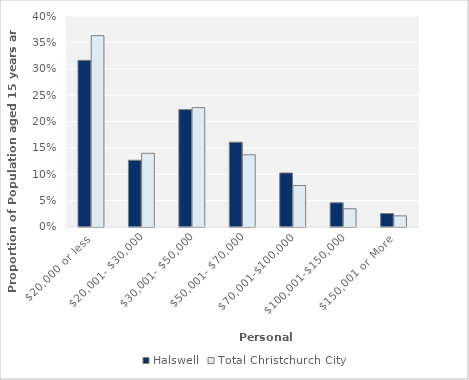
| Category | Halswell | Total Christchurch City |
|---|---|---|
| $20,000 or less | 0.316 | 0.363 |
| $20,001- $30,000 | 0.127 | 0.14 |
| $30,001- $50,000 | 0.223 | 0.226 |
| $50,001- $70,000 | 0.161 | 0.137 |
| $70,001-$100,000 | 0.102 | 0.079 |
| $100,001-$150,000 | 0.046 | 0.035 |
| $150,001 or More | 0.026 | 0.021 |